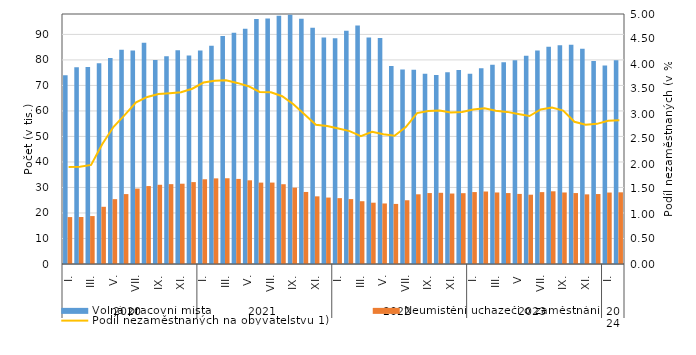
| Category | Volná pracovní místa | Neumístění uchazeči o zaměstnání |
|---|---|---|
| 0 | 73987 | 18390 |
| 1 | 77123 | 18423 |
| 2 | 77251 | 18788 |
| 3 | 78679 | 22421 |
| 4 | 80742 | 25424 |
| 5 | 83969 | 27405 |
| 6 | 83672 | 29567 |
| 7 | 86744 | 30556 |
| 8 | 79961 | 31056 |
| 9 | 81479 | 31302 |
| 10 | 83826 | 31473 |
| 11 | 81719 | 32107 |
| 12 | 83735 | 33217 |
| 13 | 85524 | 33565 |
| 14 | 89385 | 33612 |
| 15 | 90690 | 33352 |
| 16 | 92204 | 32808 |
| 17 | 96081 | 31905 |
| 18 | 96249 | 31917 |
| 19 | 97288 | 31271 |
| 20 | 97734 | 29926 |
| 21 | 96137 | 28242 |
| 22 | 92587 | 26521 |
| 23 | 88785 | 26047 |
| 24 | 88536 | 25817 |
| 25 | 91403 | 25444 |
| 26 | 93541 | 24612 |
| 27 | 88791 | 24028 |
| 28 | 88625 | 23728 |
| 29 | 77627 | 23550 |
| 30 | 76207 | 24989 |
| 31 | 76110 | 27326 |
| 32 | 74541 | 27809 |
| 33 | 74117 | 27914 |
| 34 | 75125 | 27625 |
| 35 | 76045 | 27766 |
| 36 | 74577 | 28199 |
| 37 | 76736 | 28419 |
| 38 | 78112 | 28041 |
| 39 | 79054 | 27810 |
| 40 | 79846 | 27469 |
| 41 | 81683 | 27164 |
| 42 | 83644 | 28176 |
| 43 | 85142 | 28501 |
| 44 | 85733 | 28039 |
| 45 | 85989 | 27808 |
| 46 | 84332 | 27298 |
| 47 | 79569 | 27425 |
| 48 | 77837 | 28013 |
| 49 | 79917 | 28099 |